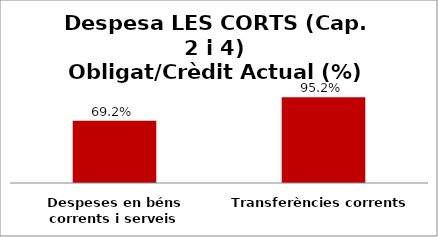
| Category | Series 0 |
|---|---|
| Despeses en béns corrents i serveis | 0.692 |
| Transferències corrents | 0.952 |